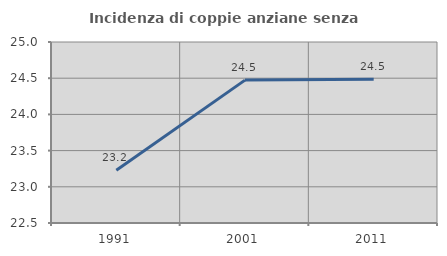
| Category | Incidenza di coppie anziane senza figli  |
|---|---|
| 1991.0 | 23.227 |
| 2001.0 | 24.474 |
| 2011.0 | 24.484 |